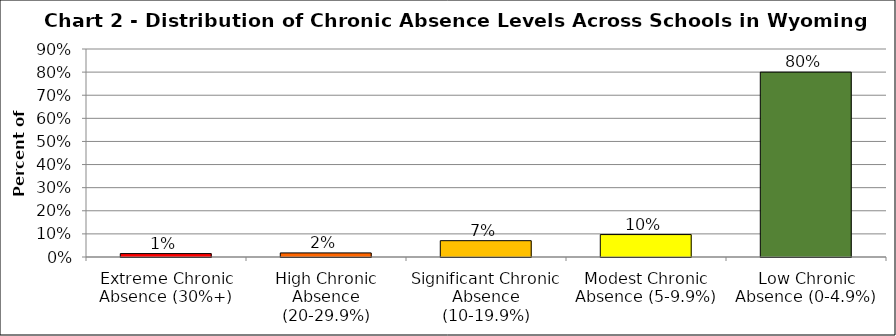
| Category | Series 1 |
|---|---|
| Extreme Chronic Absence (30%+) | 0.015 |
| High Chronic Absence (20-29.9%) | 0.018 |
| Significant Chronic Absence (10-19.9%) | 0.071 |
| Modest Chronic Absence (5-9.9%) | 0.097 |
| Low Chronic Absence (0-4.9%) | 0.8 |